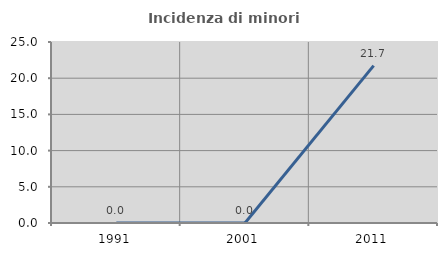
| Category | Incidenza di minori stranieri |
|---|---|
| 1991.0 | 0 |
| 2001.0 | 0 |
| 2011.0 | 21.739 |